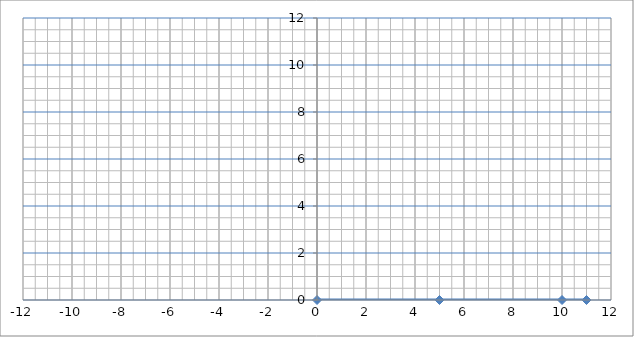
| Category | y |
|---|---|
| 0.0 | 0 |
| 5.0 | 0 |
| 10.0 | 0 |
| 11.0 | 0 |